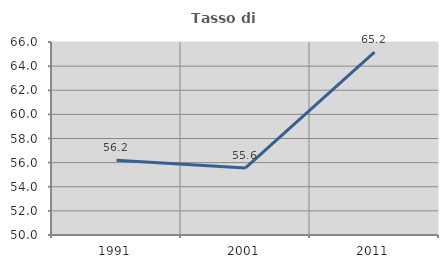
| Category | Tasso di occupazione   |
|---|---|
| 1991.0 | 56.194 |
| 2001.0 | 55.556 |
| 2011.0 | 65.165 |